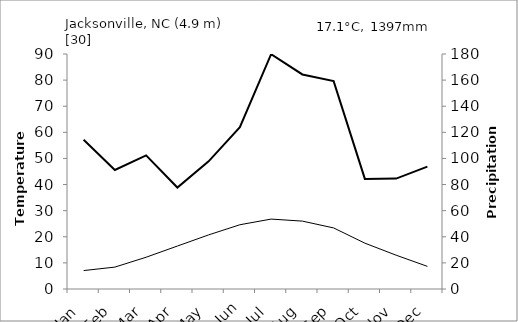
| Category | Series 0 |
|---|---|
| Jan | 7.056 |
| Feb | 8.389 |
| Mar | 12.167 |
| Apr | 16.444 |
| May | 20.722 |
| Jun | 24.611 |
| Jul | 26.778 |
| Aug | 26 |
| Sep | 23.389 |
| Oct | 17.556 |
| Nov | 12.944 |
| Dec | 8.667 |